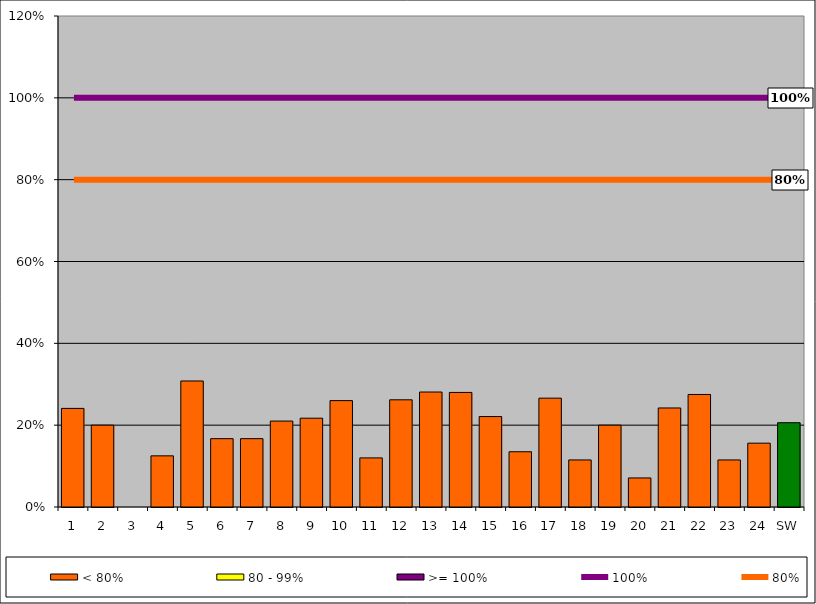
| Category | < 80% | 80 - 99% | >= 100% |
|---|---|---|---|
| 1 | 0.241 | 0 | 0 |
| 2 | 0.2 | 0 | 0 |
| 3 | 0 | 0 | 0 |
| 4 | 0.125 | 0 | 0 |
| 5 | 0.308 | 0 | 0 |
| 6 | 0.167 | 0 | 0 |
| 7 | 0.167 | 0 | 0 |
| 8 | 0.21 | 0 | 0 |
| 9 | 0.217 | 0 | 0 |
| 10 | 0.26 | 0 | 0 |
| 11 | 0.12 | 0 | 0 |
| 12 | 0.262 | 0 | 0 |
| 13 | 0.281 | 0 | 0 |
| 14 | 0.28 | 0 | 0 |
| 15 | 0.221 | 0 | 0 |
| 16 | 0.135 | 0 | 0 |
| 17 | 0.266 | 0 | 0 |
| 18 | 0.115 | 0 | 0 |
| 19 | 0.2 | 0 | 0 |
| 20 | 0.071 | 0 | 0 |
| 21 | 0.242 | 0 | 0 |
| 22 | 0.275 | 0 | 0 |
| 23 | 0.115 | 0 | 0 |
| 24 | 0.156 | 0 | 0 |
| SW | 0.206 | 0 | 0 |